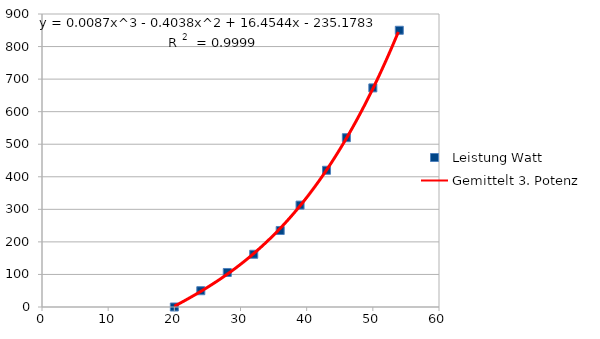
| Category | Leistung Watt |
|---|---|
| 20.0 | 0 |
| 24.0 | 50 |
| 28.0 | 106 |
| 32.0 | 162 |
| 36.0 | 235 |
| 39.0 | 313 |
| 43.0 | 420 |
| 46.0 | 520 |
| 50.0 | 673 |
| 54.0 | 850 |